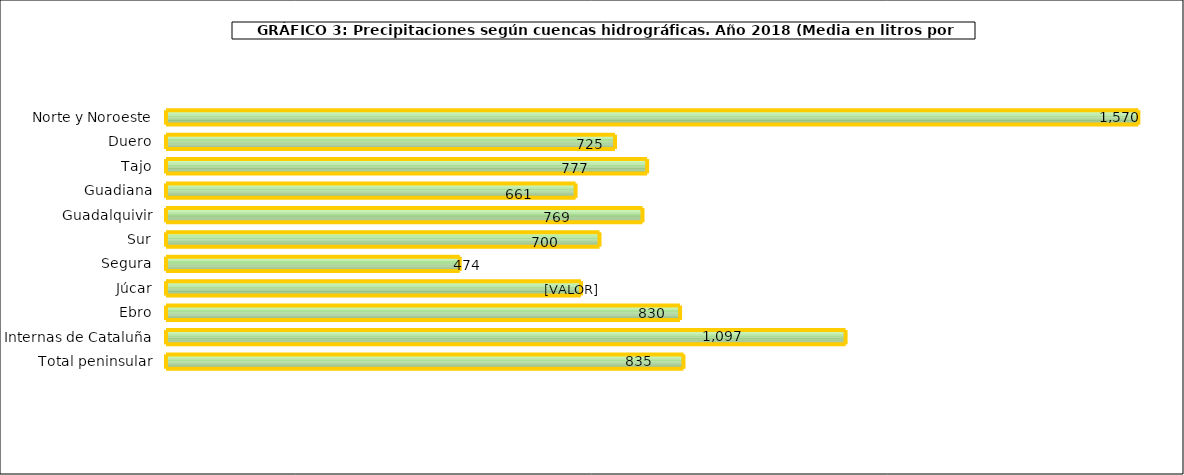
| Category | cuencas |
|---|---|
| 0 | 1569.9 |
| 1 | 724.9 |
| 2 | 776.8 |
| 3 | 661.3 |
| 4 | 769.3 |
| 5 | 699.9 |
| 6 | 474.2 |
| 7 | 669.9 |
| 8 | 830 |
| 9 | 1097.2 |
| 10 | 835.465 |